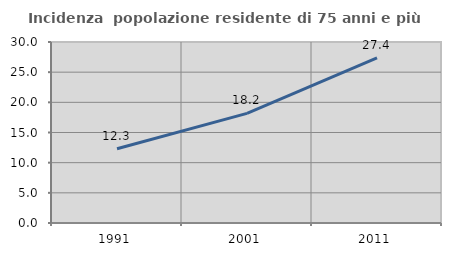
| Category | Incidenza  popolazione residente di 75 anni e più |
|---|---|
| 1991.0 | 12.297 |
| 2001.0 | 18.171 |
| 2011.0 | 27.376 |